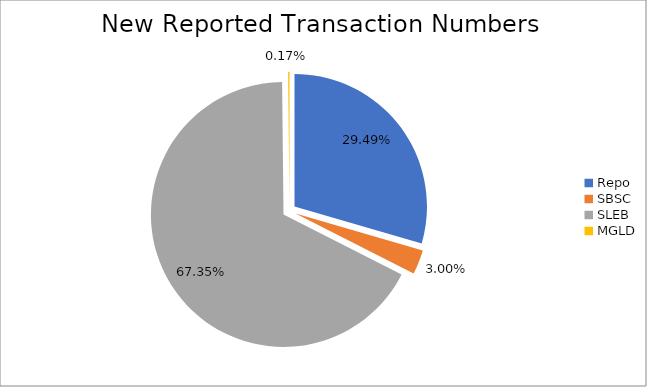
| Category | Series 0 |
|---|---|
| Repo | 408120 |
| SBSC | 41478 |
| SLEB | 932055 |
| MGLD | 2334 |